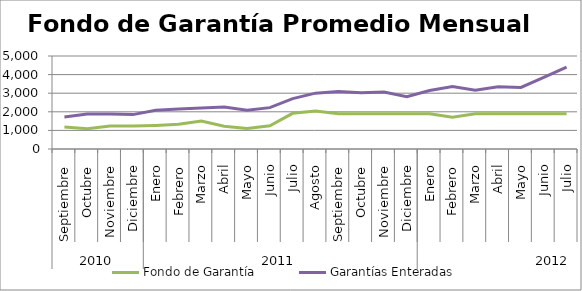
| Category | Fondo de Garantía | Garantías Enteradas |
|---|---|---|
| 0 | 1186.765 | 1723.136 |
| 1 | 1091.277 | 1878.561 |
| 2 | 1240.142 | 1886.493 |
| 3 | 1233.184 | 1848.941 |
| 4 | 1267.175 | 2079.773 |
| 5 | 1328.315 | 2151.804 |
| 6 | 1507.218 | 2200.488 |
| 7 | 1222.61 | 2253.818 |
| 8 | 1097.438 | 2081.441 |
| 9 | 1248.758 | 2223.666 |
| 10 | 1917.982 | 2706.525 |
| 11 | 2038.339 | 3002.384 |
| 12 | 1900.513 | 3095.395 |
| 13 | 1900.513 | 3029.373 |
| 14 | 1900.513 | 3060.179 |
| 15 | 1900.513 | 2809.042 |
| 16 | 1896.798 | 3141.641 |
| 17 | 1714.423 | 3362.648 |
| 18 | 1900.513 | 3154.118 |
| 19 | 1900.513 | 3348.058 |
| 20 | 1898.685 | 3308.859 |
| 21 | 1900.513 | 3850.375 |
| 22 | 1900.513 | 4400.539 |